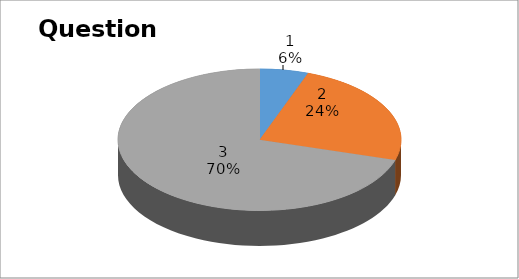
| Category | Series 0 |
|---|---|
| 0 | 3 |
| 1 | 13 |
| 2 | 38 |